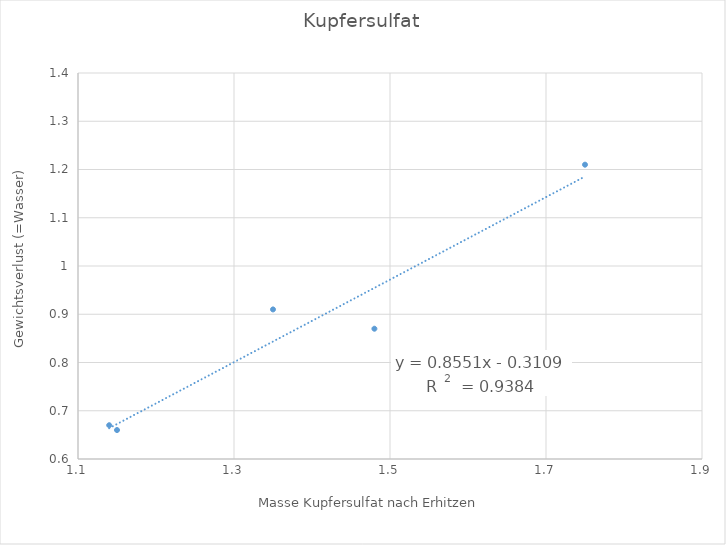
| Category | Series 0 |
|---|---|
| 1.35 | 0.91 |
| 1.75 | 1.21 |
| 1.15 | 0.66 |
| 1.48 | 0.87 |
| 1.14 | 0.67 |